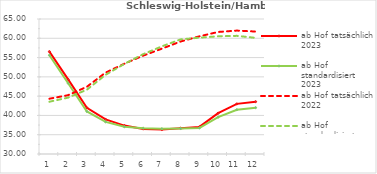
| Category | ab Hof tatsächlich 2023 | ab Hof standardisiert 2023 | ab Hof tatsächlich 2022 | ab Hof standardisiert 2022 |
|---|---|---|---|---|
| 0 | 56.551 | 55.598 | 44.329 | 43.55 |
| 1 | 49.335 | 48.353 | 45.249 | 44.619 |
| 2 | 41.985 | 41.035 | 47.431 | 46.672 |
| 3 | 38.968 | 38.317 | 51.107 | 50.537 |
| 4 | 37.364 | 37.066 | 53.406 | 53.359 |
| 5 | 36.51 | 36.702 | 55.491 | 55.871 |
| 6 | 36.341 | 36.551 | 57.311 | 57.909 |
| 7 | 36.69 | 36.6 | 59.167 | 59.712 |
| 8 | 37.026 | 36.743 | 60.502 | 60.159 |
| 9 | 40.577 | 39.545 | 61.637 | 60.516 |
| 10 | 42.995 | 41.48 | 61.997 | 60.631 |
| 11 | 43.564 | 42.004 | 61.747 | 60.109 |